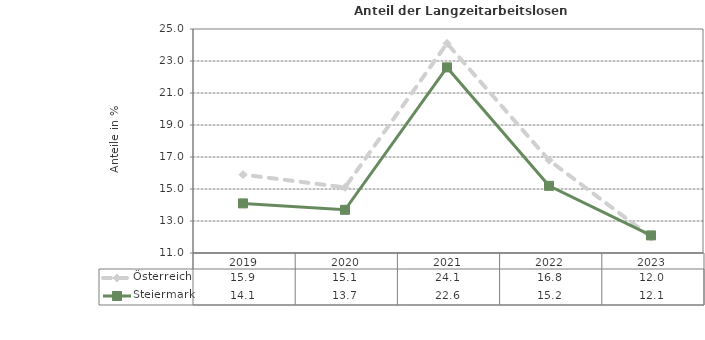
| Category | Österreich | Steiermark |
|---|---|---|
| 2023.0 | 12 | 12.1 |
| 2022.0 | 16.8 | 15.2 |
| 2021.0 | 24.1 | 22.6 |
| 2020.0 | 15.1 | 13.7 |
| 2019.0 | 15.9 | 14.1 |